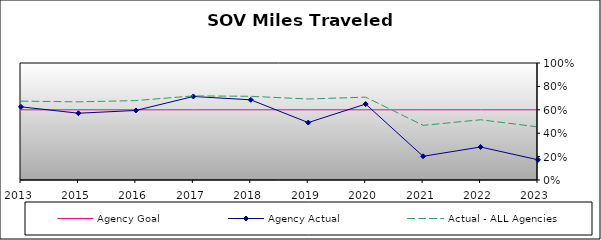
| Category | Agency Goal | Agency Actual | Actual - ALL Agencies |
|---|---|---|---|
| 2013.0 | 0.6 | 0.625 | 0.674 |
| 2015.0 | 0.6 | 0.571 | 0.668 |
| 2016.0 | 0.6 | 0.594 | 0.679 |
| 2017.0 | 0.6 | 0.714 | 0.719 |
| 2018.0 | 0.6 | 0.685 | 0.715 |
| 2019.0 | 0.6 | 0.491 | 0.692 |
| 2020.0 | 0.6 | 0.649 | 0.708 |
| 2021.0 | 0.6 | 0.202 | 0.467 |
| 2022.0 | 0.6 | 0.282 | 0.515 |
| 2023.0 | 0.6 | 0.173 | 0.454 |